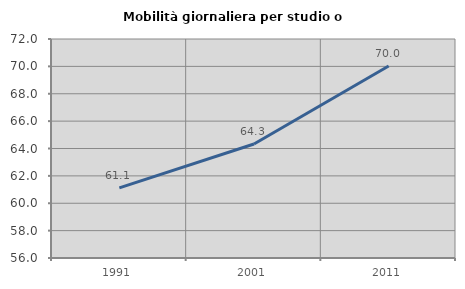
| Category | Mobilità giornaliera per studio o lavoro |
|---|---|
| 1991.0 | 61.122 |
| 2001.0 | 64.326 |
| 2011.0 | 70.023 |